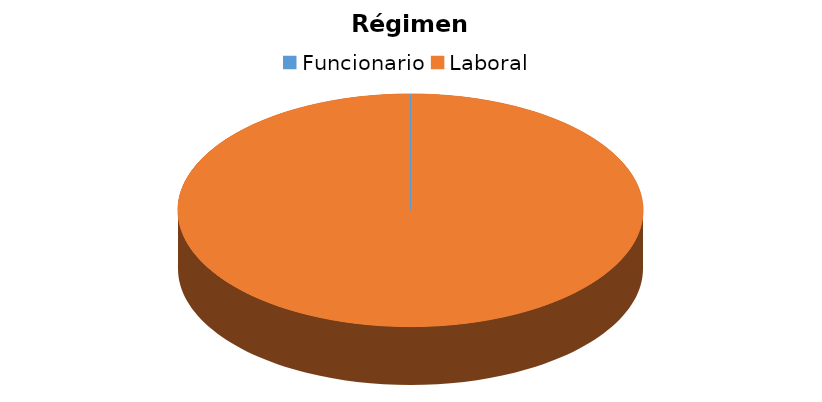
| Category | Régimen Jurídico |
|---|---|
| Funcionario | 0 |
| Laboral | 22 |